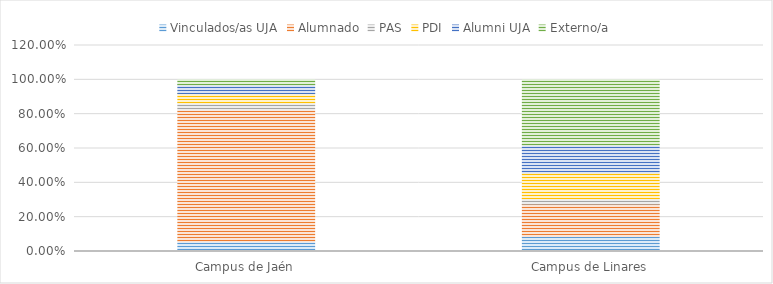
| Category | Vinculados/as UJA | Alumnado | PAS | PDI | Alumni UJA | Externo/a |
|---|---|---|---|---|---|---|
| Campus de Jaén | 0.056 | 0.768 | 0.041 | 0.054 | 0.05 | 0.03 |
| Campus de Linares | 0.087 | 0.188 | 0.033 | 0.15 | 0.161 | 0.382 |